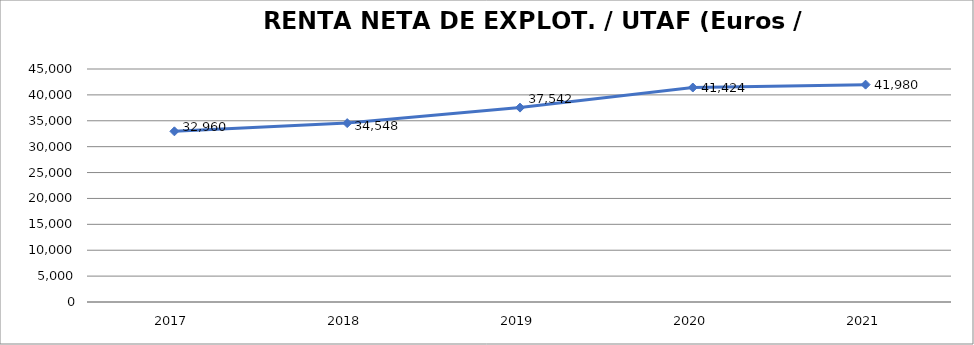
| Category | 2017 |
|---|---|
| 2017.0 | 32959.749 |
| 2018.0 | 34547.878 |
| 2019.0 | 37542.222 |
| 2020.0 | 41423.911 |
| 2021.0 | 41980 |